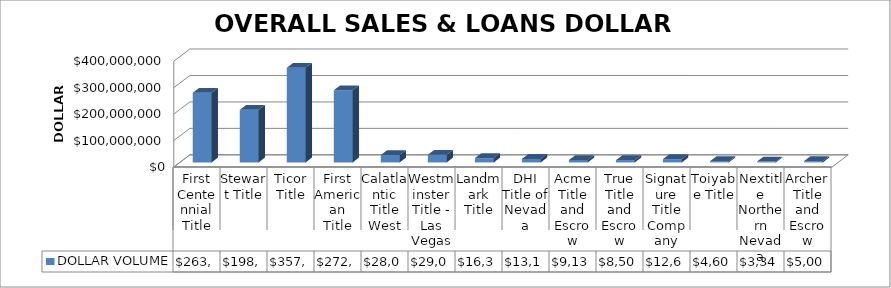
| Category | DOLLAR VOLUME |
|---|---|
| First Centennial Title | 263210822.91 |
| Stewart Title | 198745275.97 |
| Ticor Title | 357790666 |
| First American Title | 272804776.81 |
| Calatlantic Title West | 28070430 |
| Westminster Title - Las Vegas | 29008496 |
| Landmark Title | 16324000 |
| DHI Title of Nevada | 13177209 |
| Acme Title and Escrow | 9137900 |
| True Title and Escrow | 8508099 |
| Signature Title Company | 12669400 |
| Toiyabe Title | 4600838 |
| Nextitle Northern Nevada | 3344719 |
| Archer Title and Escrow | 5008200 |